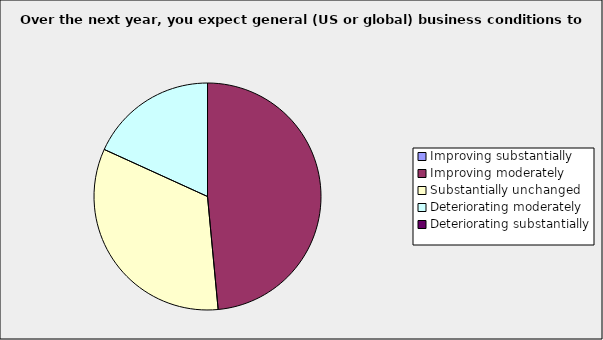
| Category | Series 0 |
|---|---|
| Improving substantially | 0 |
| Improving moderately | 0.485 |
| Substantially unchanged | 0.333 |
| Deteriorating moderately | 0.182 |
| Deteriorating substantially | 0 |